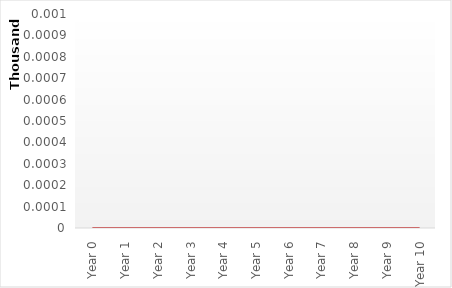
| Category | Cash flow |
|---|---|
| Year 0 | 0 |
| Year 1 | 0 |
| Year 2 | 0 |
| Year 3 | 0 |
| Year 4 | 0 |
| Year 5 | 0 |
| Year 6 | 0 |
| Year 7 | 0 |
| Year 8 | 0 |
| Year 9 | 0 |
| Year 10 | 0 |